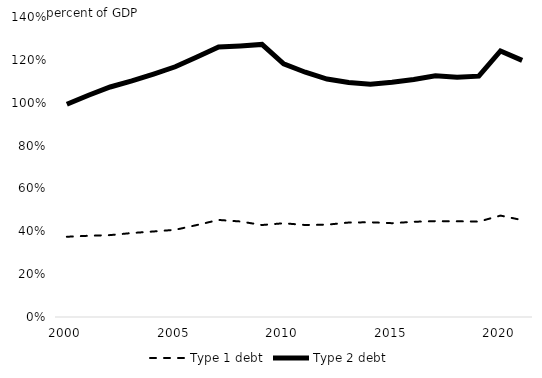
| Category | Type 1 debt | Type 2 debt |
|---|---|---|
| 2000.0 | 0.374 | 0.993 |
| 2001.0 | 0.379 | 1.035 |
| 2002.0 | 0.382 | 1.073 |
| 2003.0 | 0.392 | 1.102 |
| 2004.0 | 0.399 | 1.134 |
| 2005.0 | 0.407 | 1.168 |
| 2006.0 | 0.429 | 1.213 |
| 2007.0 | 0.453 | 1.26 |
| 2008.0 | 0.446 | 1.265 |
| 2009.0 | 0.429 | 1.272 |
| 2010.0 | 0.437 | 1.181 |
| 2011.0 | 0.429 | 1.142 |
| 2012.0 | 0.431 | 1.11 |
| 2013.0 | 0.441 | 1.095 |
| 2014.0 | 0.442 | 1.087 |
| 2015.0 | 0.438 | 1.095 |
| 2016.0 | 0.444 | 1.109 |
| 2017.0 | 0.447 | 1.126 |
| 2018.0 | 0.447 | 1.119 |
| 2019.0 | 0.445 | 1.124 |
| 2020.0 | 0.473 | 1.242 |
| 2021.0 | 0.452 | 1.198 |